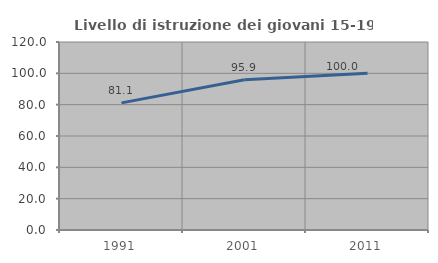
| Category | Livello di istruzione dei giovani 15-19 anni |
|---|---|
| 1991.0 | 81.141 |
| 2001.0 | 95.902 |
| 2011.0 | 100 |